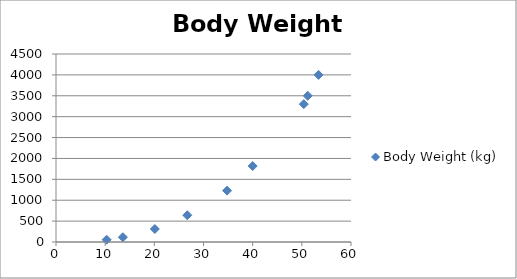
| Category | Body Weight (kg) |
|---|---|
| 10.3 | 55 |
| 13.6 | 115 |
| 20.1 | 311 |
| 26.7 | 640 |
| 34.8 | 1230 |
| 40.0 | 1818 |
| 50.4 | 3300 |
| 51.2 | 3500 |
| 53.4 | 4000 |